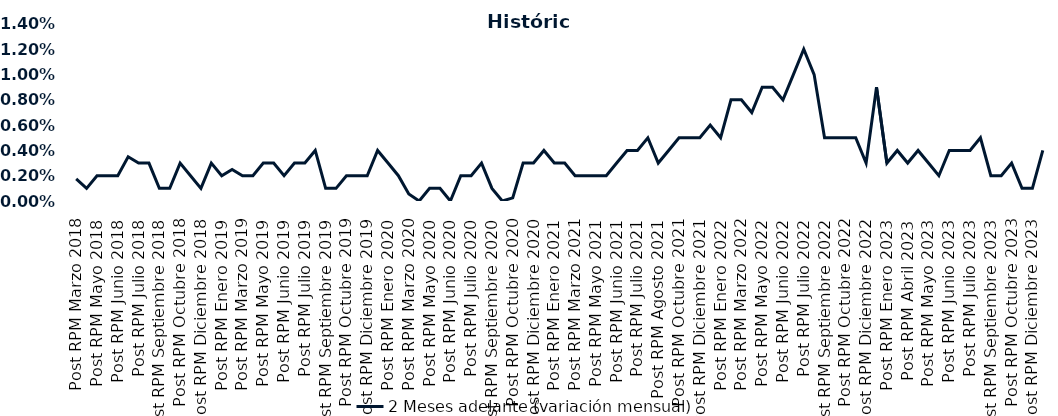
| Category | 2 Meses adelante (variación mensual) |
|---|---|
| Post RPM Marzo 2018 | 0.002 |
| Pre RPM Mayo 2018 | 0.001 |
| Post RPM Mayo 2018 | 0.002 |
| Pre RPM Junio 2018 | 0.002 |
| Post RPM Junio 2018 | 0.002 |
| Pre RPM Julio 2018 | 0.004 |
| Post RPM Julio 2018 | 0.003 |
| Pre RPM Septiembre 2018 | 0.003 |
| Post RPM Septiembre 2018 | 0.001 |
| Pre RPM Octubre 2018 | 0.001 |
| Post RPM Octubre 2018 | 0.003 |
| Pre RPM Diciembre 2018 | 0.002 |
| Post RPM Diciembre 2018 | 0.001 |
| Pre RPM Enero 2019 | 0.003 |
| Post RPM Enero 2019 | 0.002 |
| Pre RPM Marzo 2019 | 0.002 |
| Post RPM Marzo 2019 | 0.002 |
| Pre RPM Mayo 2019 | 0.002 |
| Post RPM Mayo 2019 | 0.003 |
| Pre RPM Junio 2019 | 0.003 |
| Post RPM Junio 2019 | 0.002 |
| Pre RPM Julio 2019 | 0.003 |
| Post RPM Julio 2019 | 0.003 |
| Pre RPM Septiembre 2019 | 0.004 |
| Post RPM Septiembre 2019 | 0.001 |
| Pre RPM Octubre 2019 | 0.001 |
| Post RPM Octubre 2019 | 0.002 |
| Pre RPM Diciembre 2019 | 0.002 |
| Post RPM Diciembre 2019 | 0.002 |
| Pre RPM Enero 2020 | 0.004 |
| Post RPM Enero 2020 | 0.003 |
| Pre RPM Marzo 2020 | 0.002 |
| Post RPM Marzo 2020 | 0.001 |
| Pre RPM Mayo 2020 | 0 |
| Post RPM Mayo 2020 | 0.001 |
| Pre RPM Junio 2020 | 0.001 |
| Post RPM Junio 2020 | 0 |
| Pre RPM Julio 2020 | 0.002 |
| Post RPM Julio 2020 | 0.002 |
| Pre RPM Septiembre 2020 | 0.003 |
| Post RPM Septiembre 2020 | 0.001 |
| Pre RPM Octubre 2020 | 0 |
| Post RPM Octubre 2020 | 0 |
| Pre RPM Diciembre 2020 | 0.003 |
| Post RPM Diciembre 2020 | 0.003 |
| Pre RPM Enero 2021 | 0.004 |
| Post RPM Enero 2021 | 0.003 |
| Pre RPM Marzo 2021 | 0.003 |
| Post RPM Marzo 2021 | 0.002 |
| Pre RPM Mayo 2021 | 0.002 |
| Post RPM Mayo 2021 | 0.002 |
| Pre RPM Junio 2021 | 0.002 |
| Post RPM Junio 2021 | 0.003 |
| Pre RPM Julio 2021 | 0.004 |
| Post RPM Julio 2021 | 0.004 |
| Pre RPM Agosto 2021 | 0.005 |
| Post RPM Agosto 2021 | 0.003 |
| Pre RPM Octubre 2021 | 0.004 |
| Post RPM Octubre 2021 | 0.005 |
| Pre RPM Diciembre 2021 | 0.005 |
| Post RPM Diciembre 2021 | 0.005 |
| Pre RPM Enero 2022 | 0.006 |
| Post RPM Enero 2022 | 0.005 |
| Pre RPM Marzo 2022 | 0.008 |
| Post RPM Marzo 2022 | 0.008 |
| Pre RPM Mayo 2022 | 0.007 |
| Post RPM Mayo 2022 | 0.009 |
| Pre RPM Junio 2022 | 0.009 |
| Post RPM Junio 2022 | 0.008 |
| Pre RPM Julio 2022 | 0.01 |
| Post RPM Julio 2022 | 0.012 |
| Pre RPM Septiembre 2022 | 0.01 |
| Post RPM Septiembre 2022 | 0.005 |
| Pre RPM Octubre 2022 | 0.005 |
| Post RPM Octubre 2022 | 0.005 |
| Pre RPM Diciembre 2022 | 0.005 |
| Post RPM Diciembre 2022 | 0.003 |
| Pre RPM Enero 2023 | 0.009 |
| Post RPM Enero 2023 | 0.003 |
| Pre RPM Abril 2023 | 0.004 |
| Post RPM Abril 2023 | 0.003 |
| Pre RPM Mayo 2023 | 0.004 |
| Post RPM Mayo 2023 | 0.003 |
| Pre RPM Junio 2023 | 0.002 |
| Post RPM Junio 2023 | 0.004 |
| Pre RPM Julio 2023 | 0.004 |
| Post RPM Julio 2023 | 0.004 |
| Pre RPM Septiembre 2023 | 0.005 |
| Post RPM Septiembre 2023 | 0.002 |
| Pre RPM Octubre 2023 | 0.002 |
| Post RPM Octubre 2023 | 0.003 |
| Pre RPM Diciembre 2023 | 0.001 |
| Post RPM Diciembre 2023 | 0.001 |
| Pre RPM Enero 2024 | 0.004 |